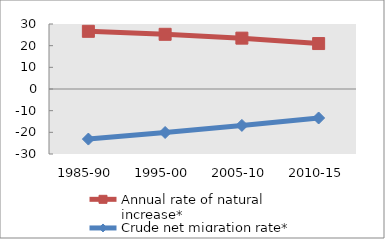
| Category | Annual rate of natural increase* | Crude net migration rate* |
|---|---|---|
| 1985-90 | 26.62 | -23.108 |
| 1995-00 | 25.241 | -20.071 |
| 2005-10 | 23.469 | -16.801 |
| 2010-15 | 20.977 | -13.384 |